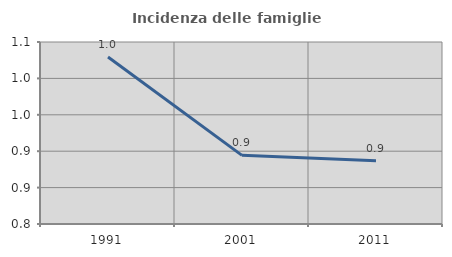
| Category | Incidenza delle famiglie numerose |
|---|---|
| 1991.0 | 1.029 |
| 2001.0 | 0.894 |
| 2011.0 | 0.887 |